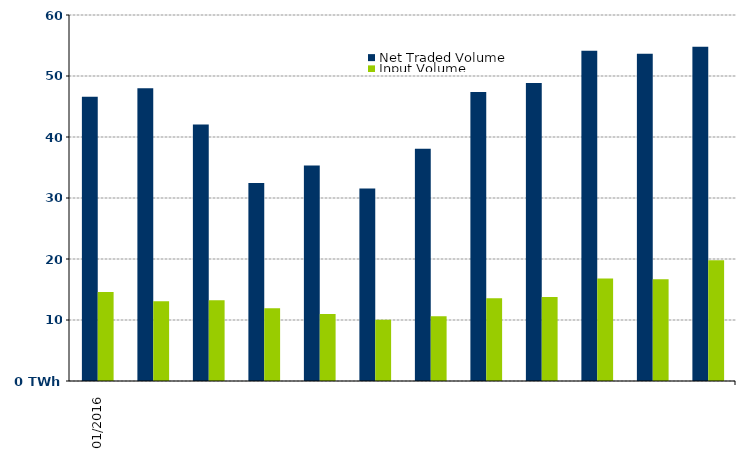
| Category | Net Traded Volume | Input Volume |
|---|---|---|
| 2016-01-01 | 46.611 | 14.609 |
| 2016-02-01 | 48.004 | 13.057 |
| 2016-03-01 | 42.058 | 13.239 |
| 2016-04-01 | 32.479 | 11.941 |
| 2016-05-01 | 35.331 | 10.995 |
| 2016-06-01 | 31.545 | 10.054 |
| 2016-07-01 | 38.065 | 10.607 |
| 2016-08-01 | 47.385 | 13.584 |
| 2016-09-01 | 48.857 | 13.766 |
| 2016-10-01 | 54.156 | 16.796 |
| 2016-11-01 | 53.634 | 16.689 |
| 2016-12-01 | 54.785 | 19.788 |